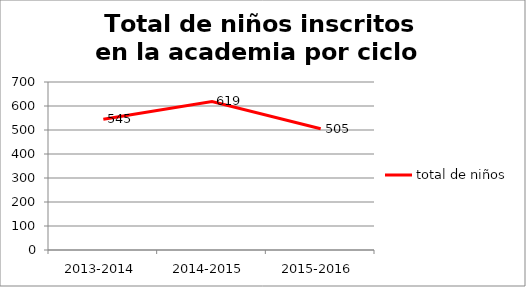
| Category | total de niños |
|---|---|
| 2013-2014 | 545 |
| 2014-2015 | 619 |
| 2015-2016 | 505 |